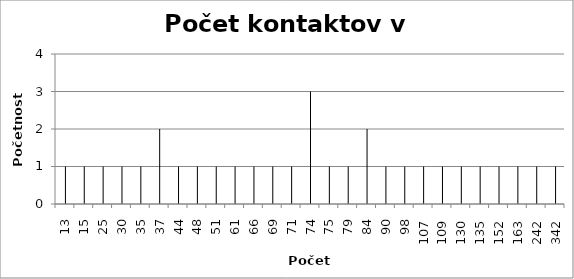
| Category | Series 0 |
|---|---|
| 13.0 | 1 |
| 15.0 | 1 |
| 25.0 | 1 |
| 30.0 | 1 |
| 35.0 | 1 |
| 37.0 | 2 |
| 44.0 | 1 |
| 48.0 | 1 |
| 51.0 | 1 |
| 61.0 | 1 |
| 66.0 | 1 |
| 69.0 | 1 |
| 71.0 | 1 |
| 74.0 | 3 |
| 75.0 | 1 |
| 79.0 | 1 |
| 84.0 | 2 |
| 90.0 | 1 |
| 98.0 | 1 |
| 107.0 | 1 |
| 109.0 | 1 |
| 130.0 | 1 |
| 135.0 | 1 |
| 152.0 | 1 |
| 163.0 | 1 |
| 242.0 | 1 |
| 342.0 | 1 |